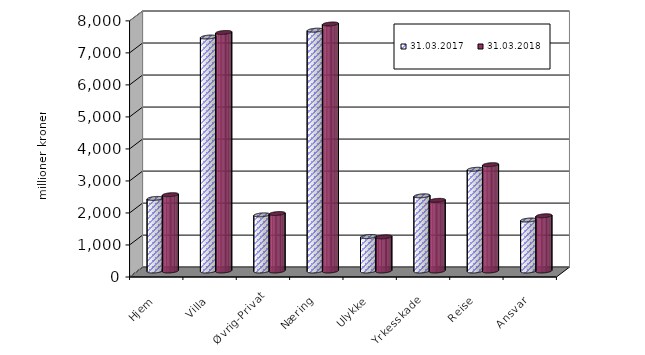
| Category | 31.03.2017 | 31.03.2018 |
|---|---|---|
| Hjem | 2267.917 | 2383.873 |
| Villa | 7308.315 | 7450.826 |
| Øvrig-Privat | 1753.278 | 1794.842 |
| Næring | 7522.276 | 7715.161 |
| Ulykke | 1075.598 | 1066.837 |
| Yrkesskade | 2348.209 | 2207.634 |
| Reise | 3177.318 | 3320.904 |
| Ansvar | 1592.354 | 1725.082 |